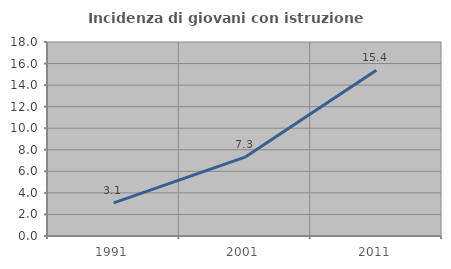
| Category | Incidenza di giovani con istruzione universitaria |
|---|---|
| 1991.0 | 3.077 |
| 2001.0 | 7.317 |
| 2011.0 | 15.385 |